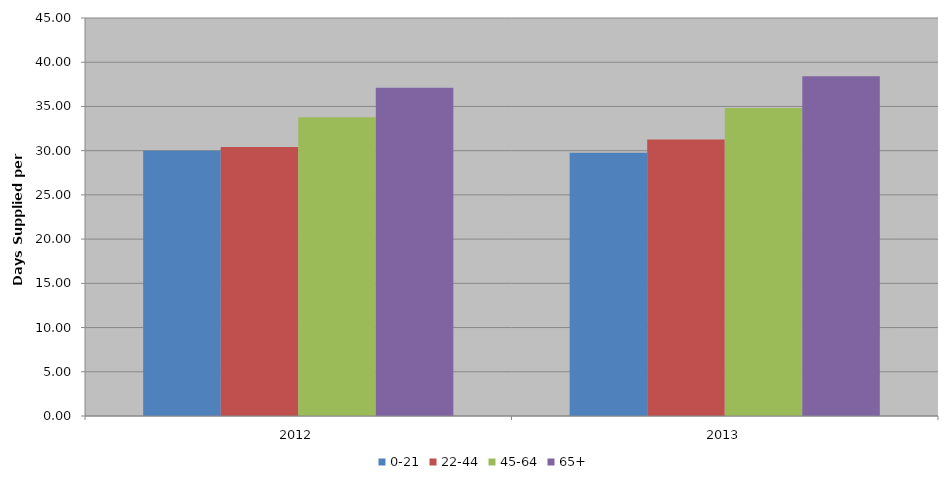
| Category | 0-21 | 22-44 | 45-64 | 65+ |
|---|---|---|---|---|
| 2012 | 30 | 30.408 | 33.779 | 37.117 |
| 2013 | 29.767 | 31.255 | 34.838 | 38.415 |